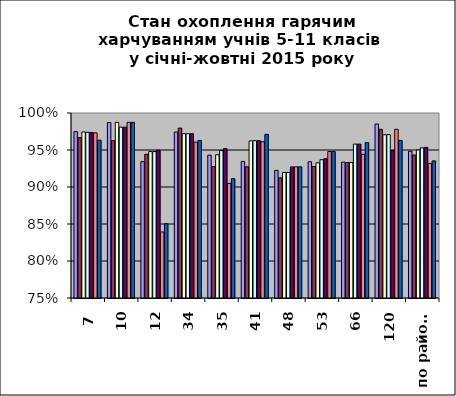
| Category | Series 0 | Series 1 | Series 2 | Series 3 | Series 4 | Series 5 | Series 6 |
|---|---|---|---|---|---|---|---|
| 7 | 0.975 | 0.967 | 0.974 | 0.974 | 0.974 | 0.973 | 0.963 |
| 10 | 0.987 | 0.963 | 0.987 | 0.981 | 0.981 | 0.987 | 0.987 |
| 12 | 0.934 | 0.944 | 0.948 | 0.948 | 0.95 | 0.839 | 0.85 |
| 34 | 0.974 | 0.98 | 0.972 | 0.972 | 0.972 | 0.961 | 0.963 |
| 35 | 0.943 | 0.928 | 0.944 | 0.949 | 0.952 | 0.905 | 0.911 |
| 41 | 0.935 | 0.927 | 0.962 | 0.963 | 0.963 | 0.961 | 0.971 |
| 48 | 0.922 | 0.912 | 0.92 | 0.92 | 0.927 | 0.927 | 0.927 |
| 53 | 0.934 | 0.928 | 0.933 | 0.937 | 0.938 | 0.948 | 0.948 |
| 66 | 0.934 | 0.933 | 0.933 | 0.958 | 0.958 | 0.944 | 0.96 |
| 120 | 0.985 | 0.978 | 0.971 | 0.971 | 0.949 | 0.978 | 0.963 |
| по району | 0.948 | 0.943 | 0.95 | 0.953 | 0.953 | 0.932 | 0.935 |